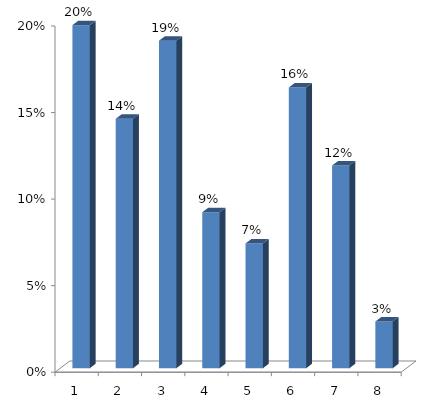
| Category | Series 0 |
|---|---|
| 0 | 0.198 |
| 1 | 0.144 |
| 2 | 0.189 |
| 3 | 0.09 |
| 4 | 0.072 |
| 5 | 0.162 |
| 6 | 0.117 |
| 7 | 0.027 |